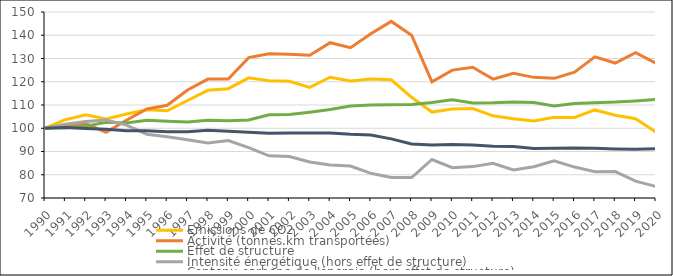
| Category | Émissions de CO2 | Activité (tonnes.km transportées) | Effet de structure | Intensité énergétique (hors effet de structure) | Contenu carbone de l'énergie (hors effet de structure) |
|---|---|---|---|---|---|
| 1990.0 | 100 | 100 | 100 | 100 | 100 |
| 1991.0 | 103.669 | 101.28 | 100.264 | 101.773 | 100.311 |
| 1992.0 | 105.839 | 102.014 | 100.916 | 102.893 | 99.918 |
| 1993.0 | 103.973 | 98.276 | 102.592 | 103.549 | 99.589 |
| 1994.0 | 106.131 | 103.442 | 102.31 | 101.344 | 98.952 |
| 1995.0 | 107.96 | 108.282 | 103.441 | 97.434 | 98.924 |
| 1996.0 | 107.484 | 109.876 | 103.031 | 96.345 | 98.547 |
| 1997.0 | 111.934 | 116.436 | 102.647 | 95.057 | 98.525 |
| 1998.0 | 116.31 | 121.141 | 103.418 | 93.672 | 99.11 |
| 1999.0 | 117.025 | 121.2 | 103.252 | 94.745 | 98.701 |
| 2000.0 | 121.696 | 130.374 | 103.561 | 91.666 | 98.329 |
| 2001.0 | 120.479 | 132.026 | 105.813 | 88.141 | 97.843 |
| 2002.0 | 120.204 | 131.866 | 105.916 | 87.878 | 97.936 |
| 2003.0 | 117.568 | 131.361 | 106.92 | 85.47 | 97.937 |
| 2004.0 | 121.93 | 136.804 | 108.078 | 84.224 | 97.913 |
| 2005.0 | 120.35 | 134.626 | 109.602 | 83.735 | 97.407 |
| 2006.0 | 121.189 | 140.678 | 110.029 | 80.618 | 97.118 |
| 2007.0 | 120.843 | 145.956 | 110.082 | 78.809 | 95.435 |
| 2008.0 | 113.312 | 139.998 | 110.21 | 78.79 | 93.21 |
| 2009.0 | 106.956 | 119.971 | 111.054 | 86.558 | 92.744 |
| 2010.0 | 108.284 | 125.011 | 112.234 | 83.012 | 92.972 |
| 2011.0 | 108.502 | 126.25 | 110.902 | 83.497 | 92.811 |
| 2012.0 | 105.336 | 121.143 | 110.955 | 84.934 | 92.268 |
| 2013.0 | 104.097 | 123.62 | 111.317 | 82.052 | 92.193 |
| 2014.0 | 103.133 | 121.893 | 111.024 | 83.461 | 91.311 |
| 2015.0 | 104.686 | 121.47 | 109.62 | 86.033 | 91.383 |
| 2016.0 | 104.659 | 124.095 | 110.627 | 83.306 | 91.513 |
| 2017.0 | 107.874 | 130.702 | 111.018 | 81.333 | 91.405 |
| 2018.0 | 105.612 | 128.046 | 111.273 | 81.36 | 91.107 |
| 2019.0 | 104.068 | 132.525 | 111.761 | 77.23 | 90.979 |
| 2020.0 | 98.316 | 127.974 | 112.394 | 74.917 | 91.239 |